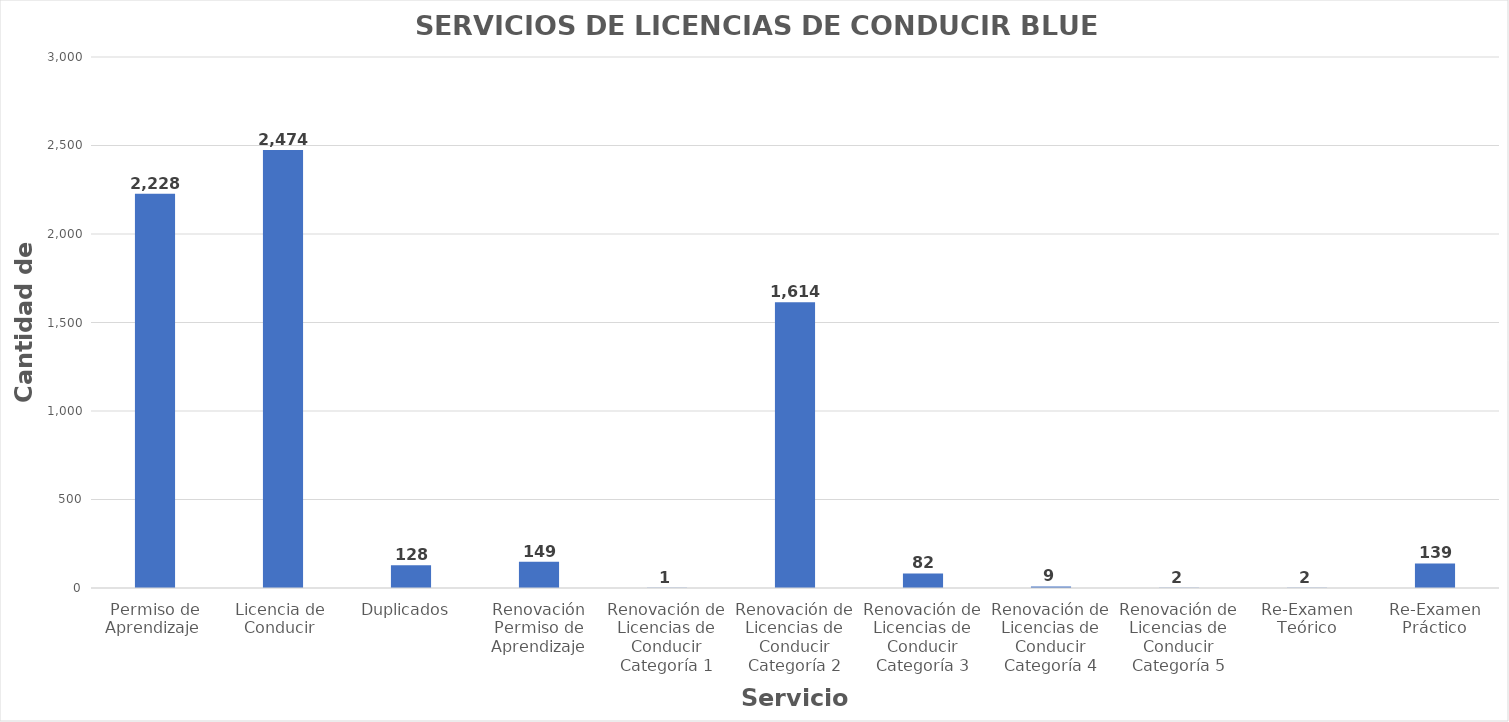
| Category | Series 0 |
|---|---|
| Permiso de Aprendizaje  | 2228 |
| Licencia de  Conducir  | 2474 |
| Duplicados  | 128 |
| Renovación Permiso de Aprendizaje | 149 |
| Renovación de Licencias de Conducir Categoría 1 | 1 |
| Renovación de Licencias de Conducir Categoría 2 | 1614 |
| Renovación de Licencias de Conducir Categoría 3 | 82 |
| Renovación de Licencias de Conducir Categoría 4 | 9 |
| Renovación de Licencias de Conducir Categoría 5 | 2 |
| Re-Examen Teórico | 2 |
| Re-Examen Práctico | 139 |